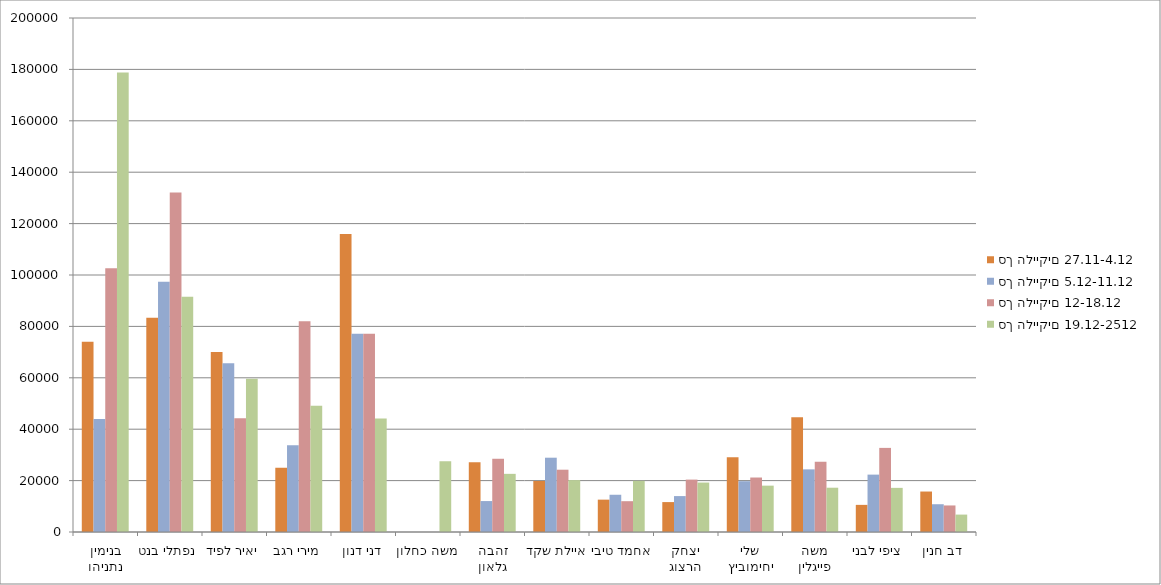
| Category | mean_comment_count_this_week | mean_like_count_this_week | mean_share_count_this_week | num_of_weekly_statuses | popularity_count | סך הלייקים 27.11-4.12 | סך הלייקים 5.12-11.12 | סך הלייקים 12-18.12 | סך הלייקים 19.12-2512 |
|---|---|---|---|---|---|---|---|---|---|
| בנימין נתניהו |  |  |  |  |  | 74031 | 43950 | 102660 | 178796 |
| נפתלי בנט |  |  |  |  |  | 83399 | 97411 | 132073 | 91568 |
| יאיר לפיד |  |  |  |  |  | 70018 | 65628 | 44264 | 59642 |
| מירי רגב |  |  |  |  |  | 24976 | 33802 | 82007 | 49097 |
| דני דנון |  |  |  |  |  | 115992 | 77100 | 77133 | 44183 |
| משה כחלון |  |  |  |  |  | 0 | 0 | 0 | 27549 |
| זהבה גלאון |  |  |  |  |  | 27110 | 12038 | 28498 | 22628 |
| איילת שקד |  |  |  |  |  | 19846 | 28910 | 24238 | 20193 |
| אחמד טיבי |  |  |  |  |  | 12591 | 14492 | 11989 | 19923 |
| יצחק הרצוג |  |  |  |  |  | 11641 | 13976 | 20387 | 19238 |
| שלי יחימוביץ |  |  |  |  |  | 29113 | 19766 | 21200 | 18037 |
| משה פייגלין |  |  |  |  |  | 44650 | 24371 | 27315 | 17232 |
| ציפי לבני |  |  |  |  |  | 10556 | 22328 | 32727 | 17172 |
| דב חנין |  |  |  |  |  | 15748 | 10807 | 10329 | 6772 |